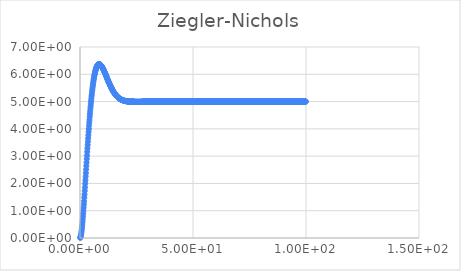
| Category | Series 0 |
|---|---|
| 0.1 | 0.006 |
| 0.2 | 0.023 |
| 0.3 | 0.05 |
| 0.4 | 0.088 |
| 0.5 | 0.135 |
| 0.6 | 0.191 |
| 0.7 | 0.255 |
| 0.8 | 0.326 |
| 0.9 | 0.405 |
| 1.0 | 0.49 |
| 1.1 | 0.582 |
| 1.2 | 0.679 |
| 1.3 | 0.781 |
| 1.4 | 0.888 |
| 1.5 | 0.999 |
| 1.6 | 1.11 |
| 1.7 | 1.23 |
| 1.8 | 1.35 |
| 1.9 | 1.48 |
| 2.0 | 1.6 |
| 2.1 | 1.73 |
| 2.2 | 1.86 |
| 2.3 | 1.99 |
| 2.4 | 2.12 |
| 2.5 | 2.25 |
| 2.6 | 2.38 |
| 2.7 | 2.51 |
| 2.8 | 2.64 |
| 2.9 | 2.77 |
| 3.0 | 2.9 |
| 3.1 | 3.03 |
| 3.2 | 3.16 |
| 3.3 | 3.29 |
| 3.4 | 3.41 |
| 3.5 | 3.53 |
| 3.6 | 3.65 |
| 3.7 | 3.77 |
| 3.8 | 3.89 |
| 3.9 | 4 |
| 4.0 | 4.12 |
| 4.1 | 4.23 |
| 4.2 | 4.33 |
| 4.3 | 4.44 |
| 4.4 | 4.54 |
| 4.5 | 4.64 |
| 4.6 | 4.74 |
| 4.7 | 4.83 |
| 4.8 | 4.92 |
| 4.9 | 5.01 |
| 5.0 | 5.09 |
| 5.1 | 5.18 |
| 5.2 | 5.25 |
| 5.3 | 5.33 |
| 5.4 | 5.4 |
| 5.5 | 5.47 |
| 5.6 | 5.54 |
| 5.7 | 5.6 |
| 5.8 | 5.66 |
| 5.9 | 5.72 |
| 6.0 | 5.78 |
| 6.1 | 5.83 |
| 6.2 | 5.88 |
| 6.3 | 5.93 |
| 6.4 | 5.97 |
| 6.5 | 6.01 |
| 6.6 | 6.05 |
| 6.7 | 6.09 |
| 6.8 | 6.12 |
| 6.9 | 6.15 |
| 7.0 | 6.18 |
| 7.1 | 6.21 |
| 7.2 | 6.23 |
| 7.3 | 6.25 |
| 7.4 | 6.27 |
| 7.5 | 6.29 |
| 7.6 | 6.31 |
| 7.7 | 6.32 |
| 7.8 | 6.33 |
| 7.9 | 6.34 |
| 8.0 | 6.35 |
| 8.1 | 6.36 |
| 8.2 | 6.36 |
| 8.3 | 6.36 |
| 8.4 | 6.37 |
| 8.5 | 6.37 |
| 8.6 | 6.37 |
| 8.7 | 6.36 |
| 8.8 | 6.36 |
| 8.9 | 6.35 |
| 9.0 | 6.35 |
| 9.1 | 6.34 |
| 9.2 | 6.33 |
| 9.3 | 6.32 |
| 9.4 | 6.31 |
| 9.5 | 6.3 |
| 9.6 | 6.29 |
| 9.7 | 6.28 |
| 9.8 | 6.26 |
| 9.9 | 6.25 |
| 10.0 | 6.23 |
| 10.1 | 6.22 |
| 10.2 | 6.2 |
| 10.3 | 6.18 |
| 10.4 | 6.17 |
| 10.5 | 6.15 |
| 10.6 | 6.13 |
| 10.7 | 6.11 |
| 10.8 | 6.09 |
| 10.9 | 6.07 |
| 11.0 | 6.06 |
| 11.1 | 6.04 |
| 11.2 | 6.02 |
| 11.3 | 6 |
| 11.4 | 5.98 |
| 11.5 | 5.96 |
| 11.6 | 5.94 |
| 11.7 | 5.92 |
| 11.8 | 5.9 |
| 11.9 | 5.87 |
| 12.0 | 5.85 |
| 12.1 | 5.83 |
| 12.2 | 5.81 |
| 12.3 | 5.79 |
| 12.4 | 5.77 |
| 12.5 | 5.75 |
| 12.6 | 5.73 |
| 12.7 | 5.71 |
| 12.8 | 5.7 |
| 12.9 | 5.68 |
| 13.0 | 5.66 |
| 13.1 | 5.64 |
| 13.2 | 5.62 |
| 13.3 | 5.6 |
| 13.4 | 5.58 |
| 13.5 | 5.57 |
| 13.6 | 5.55 |
| 13.7 | 5.53 |
| 13.8 | 5.52 |
| 13.9 | 5.5 |
| 14.0 | 5.48 |
| 14.1 | 5.47 |
| 14.2 | 5.45 |
| 14.3 | 5.44 |
| 14.4 | 5.42 |
| 14.5 | 5.41 |
| 14.6 | 5.39 |
| 14.7 | 5.38 |
| 14.8 | 5.36 |
| 14.9 | 5.35 |
| 15.0 | 5.34 |
| 15.1 | 5.32 |
| 15.2 | 5.31 |
| 15.3 | 5.3 |
| 15.4 | 5.29 |
| 15.5 | 5.28 |
| 15.6 | 5.27 |
| 15.7 | 5.26 |
| 15.8 | 5.24 |
| 15.9 | 5.23 |
| 16.0 | 5.22 |
| 16.1 | 5.22 |
| 16.2 | 5.21 |
| 16.3 | 5.2 |
| 16.4 | 5.19 |
| 16.5 | 5.18 |
| 16.6 | 5.17 |
| 16.7 | 5.16 |
| 16.8 | 5.16 |
| 16.9 | 5.15 |
| 17.0 | 5.14 |
| 17.1 | 5.13 |
| 17.2 | 5.13 |
| 17.3 | 5.12 |
| 17.4 | 5.12 |
| 17.5 | 5.11 |
| 17.6 | 5.1 |
| 17.7 | 5.1 |
| 17.8 | 5.09 |
| 17.9 | 5.09 |
| 18.0 | 5.08 |
| 18.1 | 5.08 |
| 18.2 | 5.07 |
| 18.3 | 5.07 |
| 18.4 | 5.07 |
| 18.5 | 5.06 |
| 18.6 | 5.06 |
| 18.7 | 5.06 |
| 18.8 | 5.05 |
| 18.9 | 5.05 |
| 19.0 | 5.05 |
| 19.1 | 5.04 |
| 19.2 | 5.04 |
| 19.3 | 5.04 |
| 19.4 | 5.03 |
| 19.5 | 5.03 |
| 19.6 | 5.03 |
| 19.7 | 5.03 |
| 19.8 | 5.03 |
| 19.9 | 5.02 |
| 20.0 | 5.02 |
| 20.1 | 5.02 |
| 20.2 | 5.02 |
| 20.3 | 5.02 |
| 20.4 | 5.02 |
| 20.5 | 5.01 |
| 20.6 | 5.01 |
| 20.7 | 5.01 |
| 20.8 | 5.01 |
| 20.9 | 5.01 |
| 21.0 | 5.01 |
| 21.1 | 5.01 |
| 21.2 | 5.01 |
| 21.3 | 5.01 |
| 21.4 | 5 |
| 21.5 | 5 |
| 21.6 | 5 |
| 21.7 | 5 |
| 21.8 | 5 |
| 21.9 | 5 |
| 22.0 | 5 |
| 22.1 | 5 |
| 22.2 | 5 |
| 22.3 | 5 |
| 22.4 | 5 |
| 22.5 | 5 |
| 22.6 | 5 |
| 22.7 | 5 |
| 22.8 | 5 |
| 22.9 | 5 |
| 23.0 | 5 |
| 23.1 | 5 |
| 23.2 | 5 |
| 23.3 | 5 |
| 23.4 | 5 |
| 23.5 | 5 |
| 23.6 | 5 |
| 23.7 | 5 |
| 23.8 | 5 |
| 23.9 | 4.99 |
| 24.0 | 4.99 |
| 24.1 | 4.99 |
| 24.2 | 4.99 |
| 24.3 | 4.99 |
| 24.4 | 4.99 |
| 24.5 | 4.99 |
| 24.6 | 4.99 |
| 24.7 | 4.99 |
| 24.8 | 4.99 |
| 24.9 | 4.99 |
| 25.0 | 4.99 |
| 25.1 | 4.99 |
| 25.2 | 4.99 |
| 25.3 | 4.99 |
| 25.4 | 4.99 |
| 25.5 | 4.99 |
| 25.6 | 4.99 |
| 25.7 | 4.99 |
| 25.8 | 4.99 |
| 25.9 | 4.99 |
| 26.0 | 4.99 |
| 26.1 | 4.99 |
| 26.2 | 4.99 |
| 26.3 | 4.99 |
| 26.4 | 4.99 |
| 26.5 | 4.99 |
| 26.6 | 4.99 |
| 26.7 | 4.99 |
| 26.8 | 4.99 |
| 26.9 | 4.99 |
| 27.0 | 4.99 |
| 27.1 | 4.99 |
| 27.2 | 4.99 |
| 27.3 | 4.99 |
| 27.4 | 4.99 |
| 27.5 | 4.99 |
| 27.6 | 5 |
| 27.7 | 5 |
| 27.8 | 5 |
| 27.9 | 5 |
| 28.0 | 5 |
| 28.1 | 5 |
| 28.2 | 5 |
| 28.3 | 5 |
| 28.4 | 5 |
| 28.5 | 5 |
| 28.6 | 5 |
| 28.7 | 5 |
| 28.8 | 5 |
| 28.9 | 5 |
| 29.0 | 5 |
| 29.1 | 5 |
| 29.2 | 5 |
| 29.3 | 5 |
| 29.4 | 5 |
| 29.5 | 5 |
| 29.6 | 5 |
| 29.7 | 5 |
| 29.8 | 5 |
| 29.9 | 5 |
| 30.0 | 5 |
| 30.1 | 5 |
| 30.2 | 5 |
| 30.3 | 5 |
| 30.4 | 5 |
| 30.5 | 5 |
| 30.6 | 5 |
| 30.7 | 5 |
| 30.8 | 5 |
| 30.9 | 5 |
| 31.0 | 5 |
| 31.1 | 5 |
| 31.2 | 5 |
| 31.3 | 5 |
| 31.4 | 5 |
| 31.5 | 5 |
| 31.6 | 5 |
| 31.7 | 5 |
| 31.8 | 5 |
| 31.9 | 5 |
| 32.0 | 5 |
| 32.1 | 5 |
| 32.2 | 5 |
| 32.3 | 5 |
| 32.4 | 5 |
| 32.5 | 5 |
| 32.6 | 5 |
| 32.7 | 5 |
| 32.8 | 5 |
| 32.9 | 5 |
| 33.0 | 5 |
| 33.1 | 5 |
| 33.2 | 5 |
| 33.3 | 5 |
| 33.4 | 5 |
| 33.5 | 5 |
| 33.6 | 5 |
| 33.7 | 5 |
| 33.8 | 5 |
| 33.9 | 5 |
| 34.0 | 5 |
| 34.1 | 5 |
| 34.2 | 5 |
| 34.3 | 5 |
| 34.4 | 5 |
| 34.5 | 5 |
| 34.6 | 5 |
| 34.7 | 5 |
| 34.8 | 5 |
| 34.9 | 5 |
| 35.0 | 5 |
| 35.1 | 5 |
| 35.2 | 5 |
| 35.3 | 5 |
| 35.4 | 5 |
| 35.5 | 5 |
| 35.6 | 5 |
| 35.7 | 5 |
| 35.8 | 5 |
| 35.9 | 5 |
| 36.0 | 5 |
| 36.1 | 5 |
| 36.2 | 5 |
| 36.3 | 5 |
| 36.4 | 5 |
| 36.5 | 5 |
| 36.6 | 5 |
| 36.7 | 5 |
| 36.8 | 5 |
| 36.9 | 5 |
| 37.0 | 5 |
| 37.1 | 5 |
| 37.2 | 5 |
| 37.3 | 5 |
| 37.4 | 5 |
| 37.5 | 5 |
| 37.6 | 5 |
| 37.7 | 5 |
| 37.8 | 5 |
| 37.9 | 5 |
| 38.0 | 5 |
| 38.1 | 5 |
| 38.2 | 5 |
| 38.3 | 5 |
| 38.4 | 5 |
| 38.5 | 5 |
| 38.6 | 5 |
| 38.7 | 5 |
| 38.8 | 5 |
| 38.9 | 5 |
| 39.0 | 5 |
| 39.1 | 5 |
| 39.2 | 5 |
| 39.3 | 5 |
| 39.4 | 5 |
| 39.5 | 5 |
| 39.6 | 5 |
| 39.7 | 5 |
| 39.8 | 5 |
| 39.9 | 5 |
| 40.0 | 5 |
| 40.1 | 5 |
| 40.2 | 5 |
| 40.3 | 5 |
| 40.4 | 5 |
| 40.5 | 5 |
| 40.6 | 5 |
| 40.7 | 5 |
| 40.8 | 5 |
| 40.9 | 5 |
| 41.0 | 5 |
| 41.1 | 5 |
| 41.2 | 5 |
| 41.3 | 5 |
| 41.4 | 5 |
| 41.5 | 5 |
| 41.6 | 5 |
| 41.7 | 5 |
| 41.8 | 5 |
| 41.9 | 5 |
| 42.0 | 5 |
| 42.1 | 5 |
| 42.2 | 5 |
| 42.3 | 5 |
| 42.4 | 5 |
| 42.5 | 5 |
| 42.6 | 5 |
| 42.7 | 5 |
| 42.8 | 5 |
| 42.9 | 5 |
| 43.0 | 5 |
| 43.1 | 5 |
| 43.2 | 5 |
| 43.3 | 5 |
| 43.4 | 5 |
| 43.5 | 5 |
| 43.6 | 5 |
| 43.7 | 5 |
| 43.8 | 5 |
| 43.9 | 5 |
| 44.0 | 5 |
| 44.1 | 5 |
| 44.2 | 5 |
| 44.3 | 5 |
| 44.4 | 5 |
| 44.5 | 5 |
| 44.6 | 5 |
| 44.7 | 5 |
| 44.8 | 5 |
| 44.9 | 5 |
| 45.0 | 5 |
| 45.1 | 5 |
| 45.2 | 5 |
| 45.3 | 5 |
| 45.4 | 5 |
| 45.5 | 5 |
| 45.6 | 5 |
| 45.7 | 5 |
| 45.8 | 5 |
| 45.9 | 5 |
| 46.0 | 5 |
| 46.1 | 5 |
| 46.2 | 5 |
| 46.3 | 5 |
| 46.4 | 5 |
| 46.5 | 5 |
| 46.6 | 5 |
| 46.7 | 5 |
| 46.8 | 5 |
| 46.9 | 5 |
| 47.0 | 5 |
| 47.1 | 5 |
| 47.2 | 5 |
| 47.3 | 5 |
| 47.4 | 5 |
| 47.5 | 5 |
| 47.6 | 5 |
| 47.7 | 5 |
| 47.8 | 5 |
| 47.9 | 5 |
| 48.0 | 5 |
| 48.1 | 5 |
| 48.2 | 5 |
| 48.3 | 5 |
| 48.4 | 5 |
| 48.5 | 5 |
| 48.6 | 5 |
| 48.7 | 5 |
| 48.8 | 5 |
| 48.9 | 5 |
| 49.0 | 5 |
| 49.1 | 5 |
| 49.2 | 5 |
| 49.3 | 5 |
| 49.4 | 5 |
| 49.5 | 5 |
| 49.6 | 5 |
| 49.7 | 5 |
| 49.8 | 5 |
| 49.9 | 5 |
| 50.0 | 5 |
| 50.1 | 5 |
| 50.2 | 5 |
| 50.3 | 5 |
| 50.4 | 5 |
| 50.5 | 5 |
| 50.6 | 5 |
| 50.7 | 5 |
| 50.8 | 5 |
| 50.9 | 5 |
| 51.0 | 5 |
| 51.1 | 5 |
| 51.2 | 5 |
| 51.3 | 5 |
| 51.4 | 5 |
| 51.5 | 5 |
| 51.6 | 5 |
| 51.7 | 5 |
| 51.8 | 5 |
| 51.9 | 5 |
| 52.0 | 5 |
| 52.1 | 5 |
| 52.2 | 5 |
| 52.3 | 5 |
| 52.4 | 5 |
| 52.5 | 5 |
| 52.6 | 5 |
| 52.7 | 5 |
| 52.8 | 5 |
| 52.9 | 5 |
| 53.0 | 5 |
| 53.1 | 5 |
| 53.2 | 5 |
| 53.3 | 5 |
| 53.4 | 5 |
| 53.5 | 5 |
| 53.6 | 5 |
| 53.7 | 5 |
| 53.8 | 5 |
| 53.9 | 5 |
| 54.0 | 5 |
| 54.1 | 5 |
| 54.2 | 5 |
| 54.3 | 5 |
| 54.4 | 5 |
| 54.5 | 5 |
| 54.6 | 5 |
| 54.7 | 5 |
| 54.8 | 5 |
| 54.9 | 5 |
| 55.0 | 5 |
| 55.1 | 5 |
| 55.2 | 5 |
| 55.3 | 5 |
| 55.4 | 5 |
| 55.5 | 5 |
| 55.6 | 5 |
| 55.7 | 5 |
| 55.8 | 5 |
| 55.9 | 5 |
| 56.0 | 5 |
| 56.1 | 5 |
| 56.2 | 5 |
| 56.3 | 5 |
| 56.4 | 5 |
| 56.5 | 5 |
| 56.6 | 5 |
| 56.7 | 5 |
| 56.8 | 5 |
| 56.9 | 5 |
| 57.0 | 5 |
| 57.1 | 5 |
| 57.2 | 5 |
| 57.3 | 5 |
| 57.4 | 5 |
| 57.5 | 5 |
| 57.6 | 5 |
| 57.7 | 5 |
| 57.8 | 5 |
| 57.9 | 5 |
| 58.0 | 5 |
| 58.1 | 5 |
| 58.2 | 5 |
| 58.3 | 5 |
| 58.4 | 5 |
| 58.5 | 5 |
| 58.6 | 5 |
| 58.7 | 5 |
| 58.8 | 5 |
| 58.9 | 5 |
| 59.0 | 5 |
| 59.1 | 5 |
| 59.2 | 5 |
| 59.3 | 5 |
| 59.4 | 5 |
| 59.5 | 5 |
| 59.6 | 5 |
| 59.7 | 5 |
| 59.8 | 5 |
| 59.9 | 5 |
| 60.0 | 5 |
| 60.1 | 5 |
| 60.2 | 5 |
| 60.3 | 5 |
| 60.4 | 5 |
| 60.5 | 5 |
| 60.6 | 5 |
| 60.7 | 5 |
| 60.8 | 5 |
| 60.9 | 5 |
| 61.0 | 5 |
| 61.1 | 5 |
| 61.2 | 5 |
| 61.3 | 5 |
| 61.4 | 5 |
| 61.5 | 5 |
| 61.6 | 5 |
| 61.7 | 5 |
| 61.8 | 5 |
| 61.9 | 5 |
| 62.0 | 5 |
| 62.1 | 5 |
| 62.2 | 5 |
| 62.3 | 5 |
| 62.4 | 5 |
| 62.5 | 5 |
| 62.6 | 5 |
| 62.7 | 5 |
| 62.8 | 5 |
| 62.9 | 5 |
| 63.0 | 5 |
| 63.1 | 5 |
| 63.2 | 5 |
| 63.3 | 5 |
| 63.4 | 5 |
| 63.5 | 5 |
| 63.6 | 5 |
| 63.7 | 5 |
| 63.8 | 5 |
| 63.9 | 5 |
| 64.0 | 5 |
| 64.1 | 5 |
| 64.2 | 5 |
| 64.3 | 5 |
| 64.4 | 5 |
| 64.5 | 5 |
| 64.6 | 5 |
| 64.7 | 5 |
| 64.8 | 5 |
| 64.9 | 5 |
| 65.0 | 5 |
| 65.1 | 5 |
| 65.2 | 5 |
| 65.3 | 5 |
| 65.4 | 5 |
| 65.5 | 5 |
| 65.6 | 5 |
| 65.7 | 5 |
| 65.8 | 5 |
| 65.9 | 5 |
| 66.0 | 5 |
| 66.1 | 5 |
| 66.2 | 5 |
| 66.3 | 5 |
| 66.4 | 5 |
| 66.5 | 5 |
| 66.6 | 5 |
| 66.7 | 5 |
| 66.8 | 5 |
| 66.9 | 5 |
| 67.0 | 5 |
| 67.1 | 5 |
| 67.2 | 5 |
| 67.3 | 5 |
| 67.4 | 5 |
| 67.5 | 5 |
| 67.6 | 5 |
| 67.7 | 5 |
| 67.8 | 5 |
| 67.9 | 5 |
| 68.0 | 5 |
| 68.1 | 5 |
| 68.2 | 5 |
| 68.3 | 5 |
| 68.4 | 5 |
| 68.5 | 5 |
| 68.6 | 5 |
| 68.7 | 5 |
| 68.8 | 5 |
| 68.9 | 5 |
| 69.0 | 5 |
| 69.1 | 5 |
| 69.2 | 5 |
| 69.3 | 5 |
| 69.4 | 5 |
| 69.5 | 5 |
| 69.6 | 5 |
| 69.7 | 5 |
| 69.8 | 5 |
| 69.9 | 5 |
| 70.0 | 5 |
| 70.1 | 5 |
| 70.2 | 5 |
| 70.3 | 5 |
| 70.4 | 5 |
| 70.5 | 5 |
| 70.6 | 5 |
| 70.7 | 5 |
| 70.8 | 5 |
| 70.9 | 5 |
| 71.0 | 5 |
| 71.1 | 5 |
| 71.2 | 5 |
| 71.3 | 5 |
| 71.4 | 5 |
| 71.5 | 5 |
| 71.6 | 5 |
| 71.7 | 5 |
| 71.8 | 5 |
| 71.9 | 5 |
| 72.0 | 5 |
| 72.1 | 5 |
| 72.2 | 5 |
| 72.3 | 5 |
| 72.4 | 5 |
| 72.5 | 5 |
| 72.6 | 5 |
| 72.7 | 5 |
| 72.8 | 5 |
| 72.9 | 5 |
| 73.0 | 5 |
| 73.1 | 5 |
| 73.2 | 5 |
| 73.3 | 5 |
| 73.4 | 5 |
| 73.5 | 5 |
| 73.6 | 5 |
| 73.7 | 5 |
| 73.8 | 5 |
| 73.9 | 5 |
| 74.0 | 5 |
| 74.1 | 5 |
| 74.2 | 5 |
| 74.3 | 5 |
| 74.4 | 5 |
| 74.5 | 5 |
| 74.6 | 5 |
| 74.7 | 5 |
| 74.8 | 5 |
| 74.9 | 5 |
| 75.0 | 5 |
| 75.1 | 5 |
| 75.2 | 5 |
| 75.3 | 5 |
| 75.4 | 5 |
| 75.5 | 5 |
| 75.6 | 5 |
| 75.7 | 5 |
| 75.8 | 5 |
| 75.9 | 5 |
| 76.0 | 5 |
| 76.1 | 5 |
| 76.2 | 5 |
| 76.3 | 5 |
| 76.4 | 5 |
| 76.5 | 5 |
| 76.6 | 5 |
| 76.7 | 5 |
| 76.8 | 5 |
| 76.9 | 5 |
| 77.0 | 5 |
| 77.1 | 5 |
| 77.2 | 5 |
| 77.3 | 5 |
| 77.4 | 5 |
| 77.5 | 5 |
| 77.6 | 5 |
| 77.7 | 5 |
| 77.8 | 5 |
| 77.9 | 5 |
| 78.0 | 5 |
| 78.1 | 5 |
| 78.2 | 5 |
| 78.3 | 5 |
| 78.4 | 5 |
| 78.5 | 5 |
| 78.6 | 5 |
| 78.7 | 5 |
| 78.8 | 5 |
| 78.9 | 5 |
| 79.0 | 5 |
| 79.1 | 5 |
| 79.2 | 5 |
| 79.3 | 5 |
| 79.4 | 5 |
| 79.5 | 5 |
| 79.6 | 5 |
| 79.7 | 5 |
| 79.8 | 5 |
| 79.9 | 5 |
| 80.0 | 5 |
| 80.1 | 5 |
| 80.2 | 5 |
| 80.3 | 5 |
| 80.4 | 5 |
| 80.5 | 5 |
| 80.6 | 5 |
| 80.7 | 5 |
| 80.8 | 5 |
| 80.9 | 5 |
| 81.0 | 5 |
| 81.1 | 5 |
| 81.2 | 5 |
| 81.3 | 5 |
| 81.4 | 5 |
| 81.5 | 5 |
| 81.6 | 5 |
| 81.7 | 5 |
| 81.8 | 5 |
| 81.9 | 5 |
| 82.0 | 5 |
| 82.1 | 5 |
| 82.2 | 5 |
| 82.3 | 5 |
| 82.4 | 5 |
| 82.5 | 5 |
| 82.6 | 5 |
| 82.7 | 5 |
| 82.8 | 5 |
| 82.9 | 5 |
| 83.0 | 5 |
| 83.1 | 5 |
| 83.2 | 5 |
| 83.3 | 5 |
| 83.4 | 5 |
| 83.5 | 5 |
| 83.6 | 5 |
| 83.7 | 5 |
| 83.8 | 5 |
| 83.9 | 5 |
| 84.0 | 5 |
| 84.1 | 5 |
| 84.2 | 5 |
| 84.3 | 5 |
| 84.4 | 5 |
| 84.5 | 5 |
| 84.6 | 5 |
| 84.7 | 5 |
| 84.8 | 5 |
| 84.9 | 5 |
| 85.0 | 5 |
| 85.1 | 5 |
| 85.2 | 5 |
| 85.3 | 5 |
| 85.4 | 5 |
| 85.5 | 5 |
| 85.6 | 5 |
| 85.7 | 5 |
| 85.8 | 5 |
| 85.9 | 5 |
| 86.0 | 5 |
| 86.1 | 5 |
| 86.2 | 5 |
| 86.3 | 5 |
| 86.4 | 5 |
| 86.5 | 5 |
| 86.6 | 5 |
| 86.7 | 5 |
| 86.8 | 5 |
| 86.9 | 5 |
| 87.0 | 5 |
| 87.1 | 5 |
| 87.2 | 5 |
| 87.3 | 5 |
| 87.4 | 5 |
| 87.5 | 5 |
| 87.6 | 5 |
| 87.7 | 5 |
| 87.8 | 5 |
| 87.9 | 5 |
| 88.0 | 5 |
| 88.1 | 5 |
| 88.2 | 5 |
| 88.3 | 5 |
| 88.4 | 5 |
| 88.5 | 5 |
| 88.6 | 5 |
| 88.7 | 5 |
| 88.8 | 5 |
| 88.9 | 5 |
| 89.0 | 5 |
| 89.1 | 5 |
| 89.2 | 5 |
| 89.3 | 5 |
| 89.4 | 5 |
| 89.5 | 5 |
| 89.6 | 5 |
| 89.7 | 5 |
| 89.8 | 5 |
| 89.9 | 5 |
| 90.0 | 5 |
| 90.1 | 5 |
| 90.2 | 5 |
| 90.3 | 5 |
| 90.4 | 5 |
| 90.5 | 5 |
| 90.6 | 5 |
| 90.7 | 5 |
| 90.8 | 5 |
| 90.9 | 5 |
| 91.0 | 5 |
| 91.1 | 5 |
| 91.2 | 5 |
| 91.3 | 5 |
| 91.4 | 5 |
| 91.5 | 5 |
| 91.6 | 5 |
| 91.7 | 5 |
| 91.8 | 5 |
| 91.9 | 5 |
| 92.0 | 5 |
| 92.1 | 5 |
| 92.2 | 5 |
| 92.3 | 5 |
| 92.4 | 5 |
| 92.5 | 5 |
| 92.6 | 5 |
| 92.7 | 5 |
| 92.8 | 5 |
| 92.9 | 5 |
| 93.0 | 5 |
| 93.1 | 5 |
| 93.2 | 5 |
| 93.3 | 5 |
| 93.4 | 5 |
| 93.5 | 5 |
| 93.6 | 5 |
| 93.7 | 5 |
| 93.8 | 5 |
| 93.9 | 5 |
| 94.0 | 5 |
| 94.1 | 5 |
| 94.2 | 5 |
| 94.3 | 5 |
| 94.4 | 5 |
| 94.5 | 5 |
| 94.6 | 5 |
| 94.7 | 5 |
| 94.8 | 5 |
| 94.9 | 5 |
| 95.0 | 5 |
| 95.1 | 5 |
| 95.2 | 5 |
| 95.3 | 5 |
| 95.4 | 5 |
| 95.5 | 5 |
| 95.6 | 5 |
| 95.7 | 5 |
| 95.8 | 5 |
| 95.9 | 5 |
| 96.0 | 5 |
| 96.1 | 5 |
| 96.2 | 5 |
| 96.3 | 5 |
| 96.4 | 5 |
| 96.5 | 5 |
| 96.6 | 5 |
| 96.7 | 5 |
| 96.8 | 5 |
| 96.9 | 5 |
| 97.0 | 5 |
| 97.1 | 5 |
| 97.2 | 5 |
| 97.3 | 5 |
| 97.4 | 5 |
| 97.5 | 5 |
| 97.6 | 5 |
| 97.7 | 5 |
| 97.8 | 5 |
| 97.9 | 5 |
| 98.0 | 5 |
| 98.1 | 5 |
| 98.2 | 5 |
| 98.3 | 5 |
| 98.4 | 5 |
| 98.5 | 5 |
| 98.6 | 5 |
| 98.7 | 5 |
| 98.8 | 5 |
| 98.9 | 5 |
| 99.0 | 5 |
| 99.1 | 5 |
| 99.2 | 5 |
| 99.3 | 5 |
| 99.4 | 5 |
| 99.5 | 5 |
| 99.6 | 5 |
| 99.7 | 5 |
| 99.8 | 5 |
| 99.9 | 5 |